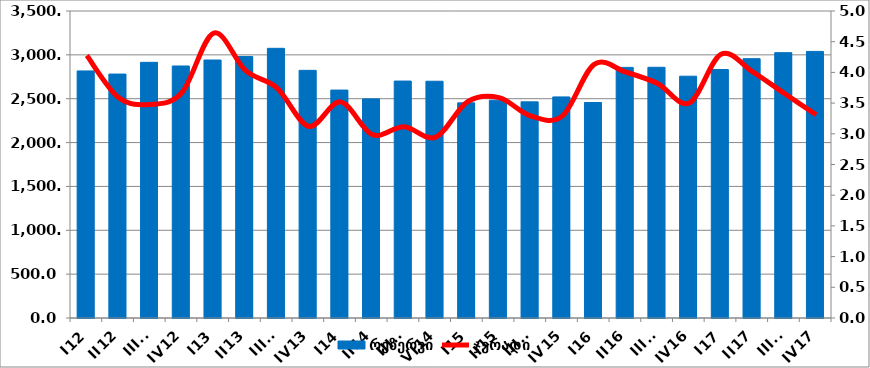
| Category | რეზერვი |
|---|---|
| I12 | 2816.705 |
| II12 | 2780.985 |
| III12 | 2914.659 |
| IV12 | 2872.974 |
| I13 | 2941.281 |
| II13 | 2981.697 |
| III13 | 3074.514 |
| IV13 | 2823.422 |
| I14 | 2598.611 |
| II14 | 2498.141 |
| III14 | 2701.162 |
| VI14 | 2699.188 |
| I15 | 2452.88 |
| II15 | 2483.75 |
| III15 | 2464.306 |
| IV15 | 2520.576 |
| I16 | 2456.679 |
| II16 | 2857.244 |
| III16 | 2858.236 |
| IV16 | 2756.452 |
| I17 | 2832.873 |
| II17 | 2956.464 |
| III17 | 3025.041 |
| IV17 | 3038.995 |